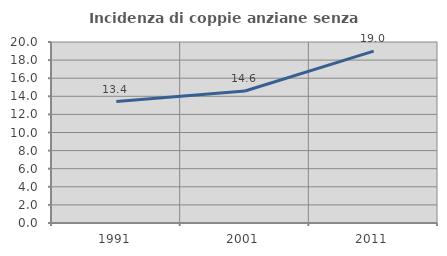
| Category | Incidenza di coppie anziane senza figli  |
|---|---|
| 1991.0 | 13.415 |
| 2001.0 | 14.58 |
| 2011.0 | 18.987 |